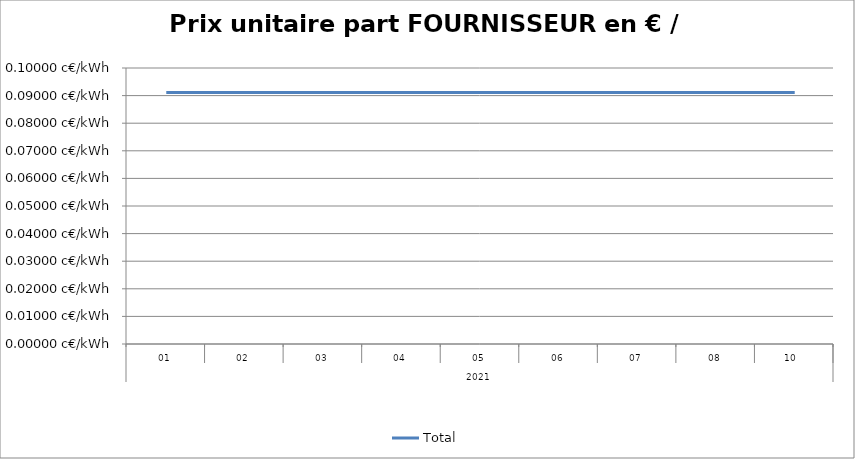
| Category | Total |
|---|---|
| 0 | 0.091 |
| 1 | 0.091 |
| 2 | 0.091 |
| 3 | 0.091 |
| 4 | 0.091 |
| 5 | 0.091 |
| 6 | 0.091 |
| 7 | 0.091 |
| 8 | 0.091 |